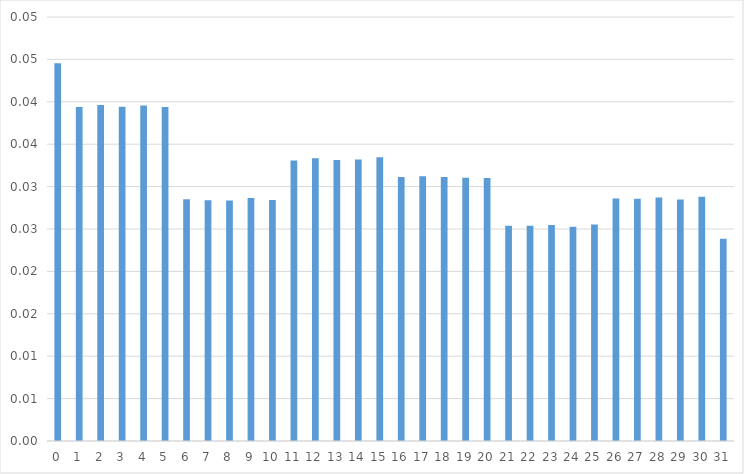
| Category | Series 0 |
|---|---|
| 0.0 | 0.045 |
| 1.0 | 0.039 |
| 2.0 | 0.04 |
| 3.0 | 0.039 |
| 4.0 | 0.04 |
| 5.0 | 0.039 |
| 6.0 | 0.028 |
| 7.0 | 0.028 |
| 8.0 | 0.028 |
| 9.0 | 0.029 |
| 10.0 | 0.028 |
| 11.0 | 0.033 |
| 12.0 | 0.033 |
| 13.0 | 0.033 |
| 14.0 | 0.033 |
| 15.0 | 0.033 |
| 16.0 | 0.031 |
| 17.0 | 0.031 |
| 18.0 | 0.031 |
| 19.0 | 0.031 |
| 20.0 | 0.031 |
| 21.0 | 0.025 |
| 22.0 | 0.025 |
| 23.0 | 0.025 |
| 24.0 | 0.025 |
| 25.0 | 0.026 |
| 26.0 | 0.029 |
| 27.0 | 0.029 |
| 28.0 | 0.029 |
| 29.0 | 0.028 |
| 30.0 | 0.029 |
| 31.0 | 0.024 |